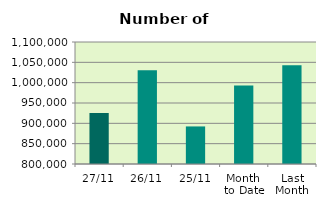
| Category | Series 0 |
|---|---|
| 27/11 | 925710 |
| 26/11 | 1030238 |
| 25/11 | 892366 |
| Month 
to Date | 993319.158 |
| Last
Month | 1042648 |